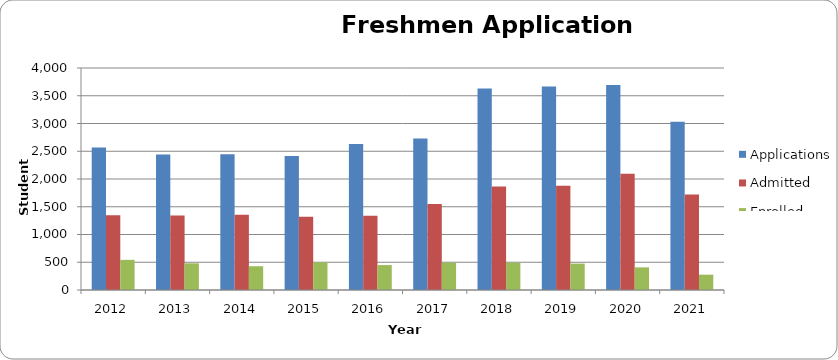
| Category | Applications | Admitted | Enrolled |
|---|---|---|---|
| 2012.0 | 2569 | 1345 | 543 |
| 2013.0 | 2441 | 1341 | 481 |
| 2014.0 | 2447 | 1356 | 428 |
| 2015.0 | 2413 | 1320 | 499 |
| 2016.0 | 2632 | 1337 | 449 |
| 2017.0 | 2729 | 1549 | 492 |
| 2018.0 | 3629 | 1863 | 493 |
| 2019.0 | 3668 | 1878 | 476 |
| 2020.0 | 3693 | 2096 | 408 |
| 2021.0 | 3032 | 1719 | 276 |